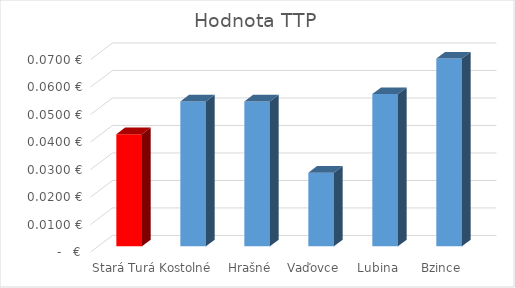
| Category | Hodnota TTP |
|---|---|
| Stará Turá | 0.041 |
| Kostolné | 0.053 |
| Hrašné | 0.053 |
| Vaďovce | 0.027 |
| Lubina | 0.055 |
| Bzince | 0.068 |